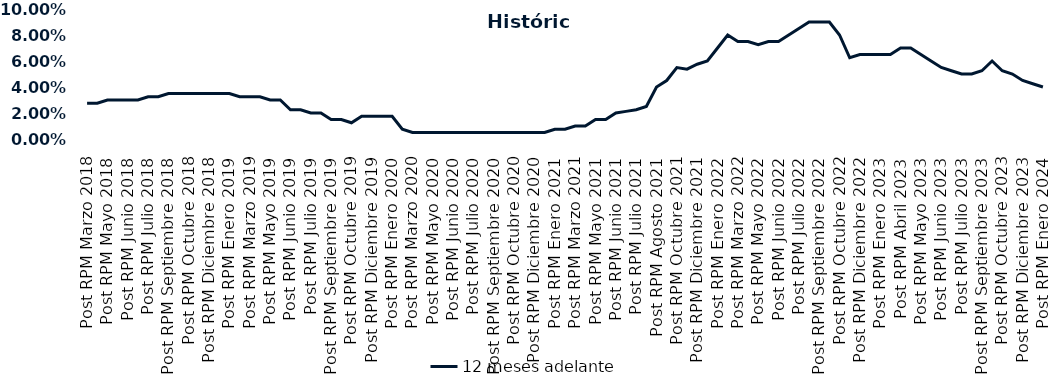
| Category | 12 meses adelante  |
|---|---|
| Post RPM Marzo 2018 | 0.028 |
| Pre RPM Mayo 2018 | 0.028 |
| Post RPM Mayo 2018 | 0.03 |
| Pre RPM Junio 2018 | 0.03 |
| Post RPM Junio 2018 | 0.03 |
| Pre RPM Julio 2018 | 0.03 |
| Post RPM Julio 2018 | 0.032 |
| Pre RPM Septiembre 2018 | 0.032 |
| Post RPM Septiembre 2018 | 0.035 |
| Pre RPM Octubre 2018 | 0.035 |
| Post RPM Octubre 2018 | 0.035 |
| Pre RPM Diciembre 2018 | 0.035 |
| Post RPM Diciembre 2018 | 0.035 |
| Pre RPM Enero 2019 | 0.035 |
| Post RPM Enero 2019 | 0.035 |
| Pre RPM Marzo 2019 | 0.032 |
| Post RPM Marzo 2019 | 0.032 |
| Pre RPM Mayo 2019 | 0.032 |
| Post RPM Mayo 2019 | 0.03 |
| Pre RPM Junio 2019 | 0.03 |
| Post RPM Junio 2019 | 0.022 |
| Pre RPM Julio 2019 | 0.022 |
| Post RPM Julio 2019 | 0.02 |
| Pre RPM Septiembre 2019 | 0.02 |
| Post RPM Septiembre 2019 | 0.015 |
| Pre RPM Octubre 2019 | 0.015 |
| Post RPM Octubre 2019 | 0.012 |
| Pre RPM Diciembre 2019 | 0.018 |
| Post RPM Diciembre 2019 | 0.018 |
| Pre RPM Enero 2020 | 0.018 |
| Post RPM Enero 2020 | 0.018 |
| Pre RPM Marzo 2020 | 0.008 |
| Post RPM Marzo 2020 | 0.005 |
| Pre RPM Mayo 2020 | 0.005 |
| Post RPM Mayo 2020 | 0.005 |
| Pre RPM Junio 2020 | 0.005 |
| Post RPM Junio 2020 | 0.005 |
| Pre RPM Julio 2020 | 0.005 |
| Post RPM Julio 2020 | 0.005 |
| Pre RPM Septiembre 2020 | 0.005 |
| Post RPM Septiembre 2020 | 0.005 |
| Pre RPM Octubre 2020 | 0.005 |
| Post RPM Octubre 2020 | 0.005 |
| Pre RPM Diciembre 2020 | 0.005 |
| Post RPM Diciembre 2020 | 0.005 |
| Pre RPM Enero 2021 | 0.005 |
| Post RPM Enero 2021 | 0.008 |
| Pre RPM Marzo 2021 | 0.008 |
| Post RPM Marzo 2021 | 0.01 |
| Pre RPM Mayo 2021 | 0.01 |
| Post RPM Mayo 2021 | 0.015 |
| Pre RPM Junio 2021 | 0.015 |
| Post RPM Junio 2021 | 0.02 |
| Pre RPM Julio 2021 | 0.021 |
| Post RPM Julio 2021 | 0.022 |
| Pre RPM Agosto 2021 | 0.025 |
| Post RPM Agosto 2021 | 0.04 |
| Pre RPM Octubre 2021 | 0.045 |
| Post RPM Octubre 2021 | 0.055 |
| Pre RPM Diciembre 2021 | 0.054 |
| Post RPM Diciembre 2021 | 0.058 |
| Pre RPM Enero 2022 | 0.06 |
| Post RPM Enero 2022 | 0.07 |
| Pre RPM Marzo 2022 | 0.08 |
| Post RPM Marzo 2022 | 0.075 |
| Pre RPM Mayo 2022 | 0.075 |
| Post RPM Mayo 2022 | 0.072 |
| Pre RPM Junio 2022 | 0.075 |
| Post RPM Junio 2022 | 0.075 |
| Pre RPM Julio 2022 | 0.08 |
| Post RPM Julio 2022 | 0.085 |
| Pre RPM Septiembre 2022 | 0.09 |
| Post RPM Septiembre 2022 | 0.09 |
| Pre RPM Octubre 2022 | 0.09 |
| Post RPM Octubre 2022 | 0.08 |
| Pre RPM Diciembre 2022 | 0.062 |
| Post RPM Diciembre 2022 | 0.065 |
| Pre RPM Enero 2023 | 0.065 |
| Post RPM Enero 2023 | 0.065 |
| Pre RPM Abril 2023 | 0.065 |
| Post RPM Abril 2023 | 0.07 |
| Pre RPM Mayo 2023 | 0.07 |
| Post RPM Mayo 2023 | 0.065 |
| Pre RPM Junio 2023 | 0.06 |
| Post RPM Junio 2023 | 0.055 |
| Pre RPM Julio 2023 | 0.052 |
| Post RPM Julio 2023 | 0.05 |
| Pre RPM Septiembre 2023 | 0.05 |
| Post RPM Septiembre 2023 | 0.052 |
| Pre RPM Octubre 2023 | 0.06 |
| Post RPM Octubre 2023 | 0.052 |
| Pre RPM Diciembre 2023 | 0.05 |
| Post RPM Diciembre 2023 | 0.045 |
| Pre RPM Enero 2024 | 0.042 |
| Post RPM Enero 2024 | 0.04 |